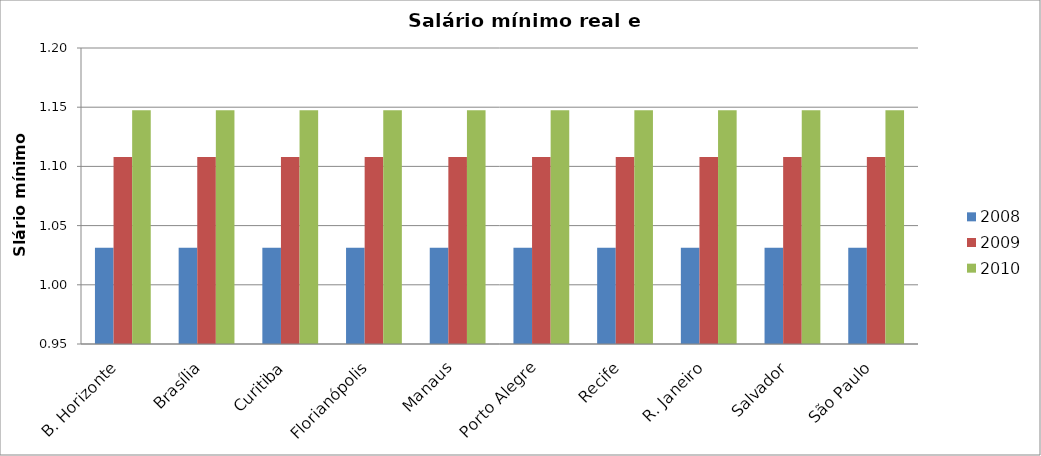
| Category | 2008 | 2009 | 2010 |
|---|---|---|---|
| B. Horizonte | 1.031 | 1.108 | 1.147 |
| Brasília | 1.031 | 1.108 | 1.147 |
| Curitiba | 1.031 | 1.108 | 1.147 |
| Florianópolis | 1.031 | 1.108 | 1.147 |
| Manaus | 1.031 | 1.108 | 1.147 |
| Porto Alegre | 1.031 | 1.108 | 1.147 |
| Recife | 1.031 | 1.108 | 1.147 |
| R. Janeiro | 1.031 | 1.108 | 1.147 |
| Salvador | 1.031 | 1.108 | 1.147 |
| São Paulo | 1.031 | 1.108 | 1.147 |